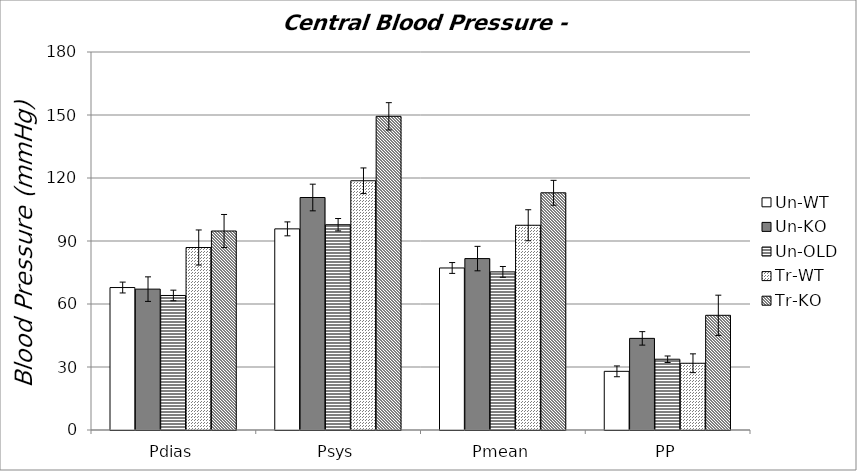
| Category | Un-WT | Un-KO | Un-OLD | Tr-WT | Tr-KO |
|---|---|---|---|---|---|
| Pdias | 67.842 | 67.082 | 64.058 | 86.903 | 94.755 |
| Psys | 95.775 | 110.714 | 97.757 | 118.687 | 149.371 |
| Pmean | 77.153 | 81.626 | 75.291 | 97.498 | 112.96 |
| PP | 27.933 | 43.632 | 33.699 | 31.784 | 54.616 |